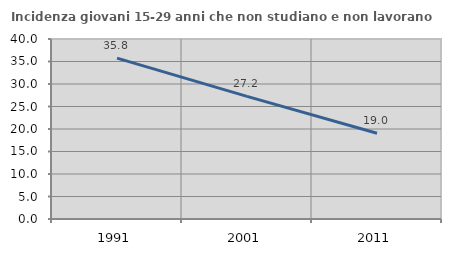
| Category | Incidenza giovani 15-29 anni che non studiano e non lavorano  |
|---|---|
| 1991.0 | 35.753 |
| 2001.0 | 27.245 |
| 2011.0 | 19.048 |